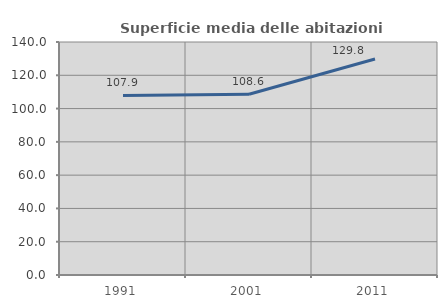
| Category | Superficie media delle abitazioni occupate |
|---|---|
| 1991.0 | 107.872 |
| 2001.0 | 108.579 |
| 2011.0 | 129.799 |